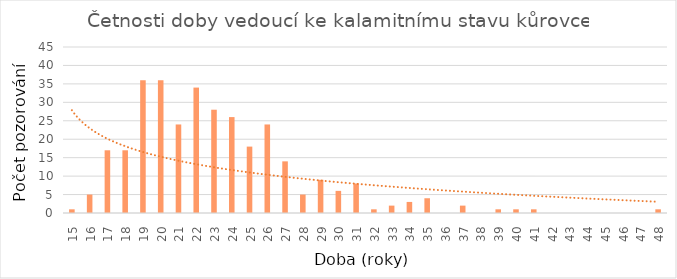
| Category | Četnosti doby |
|---|---|
| 15.0 | 1 |
| 16.0 | 5 |
| 17.0 | 17 |
| 18.0 | 17 |
| 19.0 | 36 |
| 20.0 | 36 |
| 21.0 | 24 |
| 22.0 | 34 |
| 23.0 | 28 |
| 24.0 | 26 |
| 25.0 | 18 |
| 26.0 | 24 |
| 27.0 | 14 |
| 28.0 | 5 |
| 29.0 | 9 |
| 30.0 | 6 |
| 31.0 | 8 |
| 32.0 | 1 |
| 33.0 | 2 |
| 34.0 | 3 |
| 35.0 | 4 |
| 36.0 | 0 |
| 37.0 | 2 |
| 38.0 | 0 |
| 39.0 | 1 |
| 40.0 | 1 |
| 41.0 | 1 |
| 42.0 | 0 |
| 43.0 | 0 |
| 44.0 | 0 |
| 45.0 | 0 |
| 46.0 | 0 |
| 47.0 | 0 |
| 48.0 | 1 |